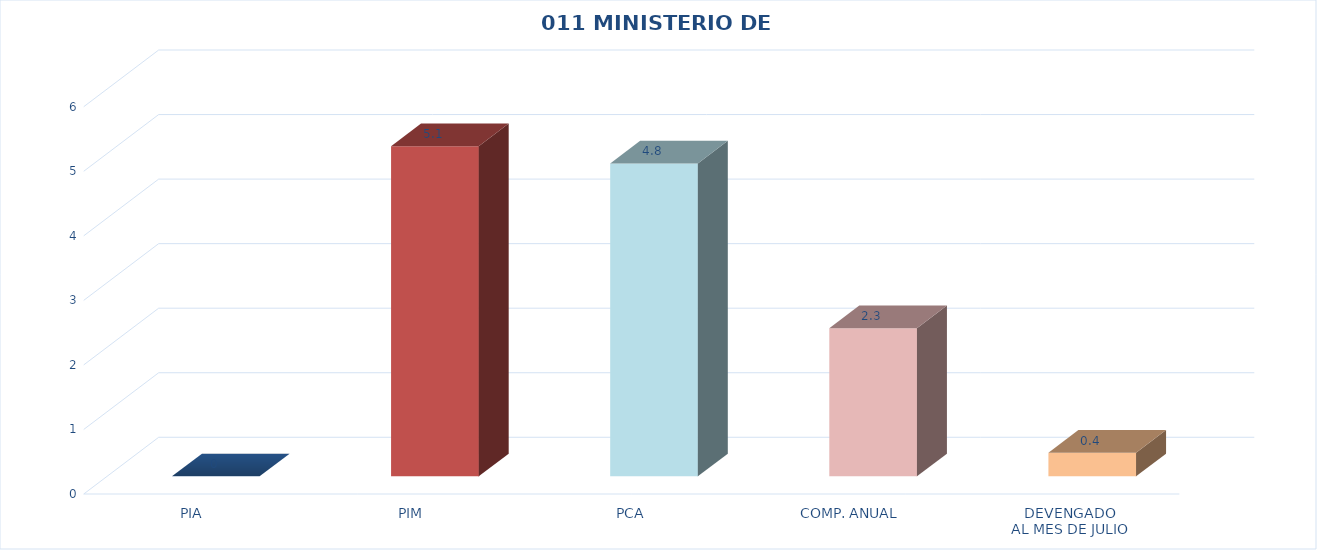
| Category | 011 MINISTERIO DE SALUD |
|---|---|
| PIA | 0 |
| PIM | 5.115 |
| PCA | 4.848 |
| COMP. ANUAL | 2.295 |
| DEVENGADO
AL MES DE JULIO | 0.366 |